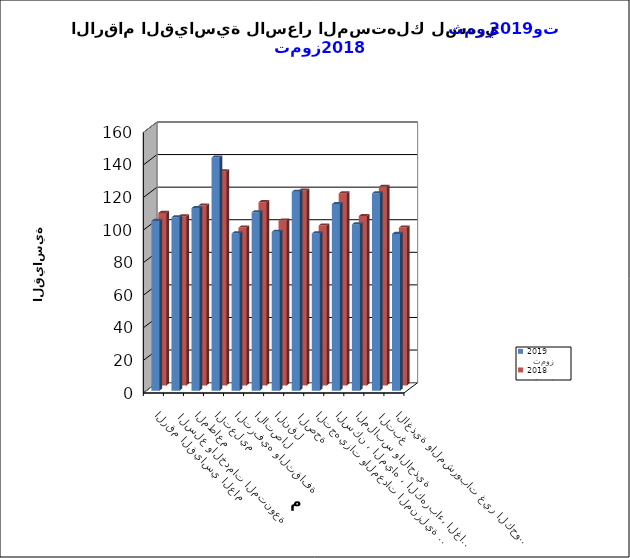
| Category |   تموز     2019      |   تموز     2018 |
|---|---|---|
| الاغذية والمشروبات غير الكحولية | 96.2 | 96.9 |
|  التبغ | 121.1 | 122 |
| الملابس والاحذية | 102.1 | 104 |
| السكن ، المياه ، الكهرباء، الغاز  | 114.5 | 117.9 |
| التجهيزات والمعدات المنزلية والصيانة | 96.5 | 98.2 |
|  الصحة | 122.1 | 119.7 |
| النقل | 97.5 | 101.2 |
| الاتصال | 109.5 | 112.5 |
| الترفيه والثقافة | 96.5 | 96.9 |
| التعليم | 143.1 | 131.5 |
| المطاعم  | 112.1 | 110.5 |
|  السلع والخدمات المتنوعة | 106.4 | 103.9 |
| الرقم القياسي العام | 104.2 | 105.9 |